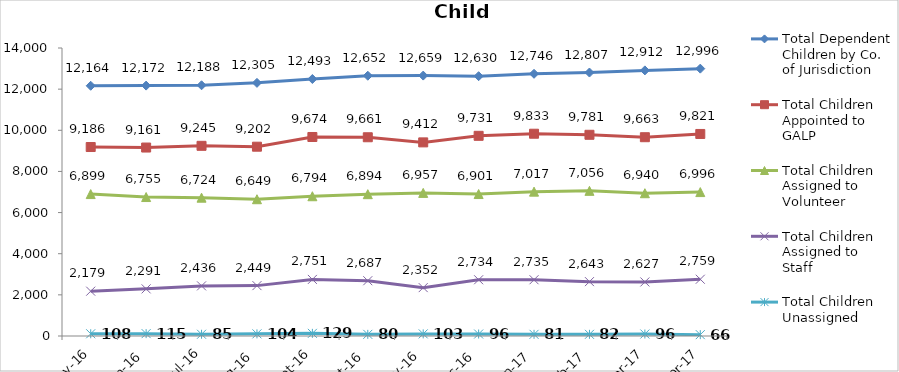
| Category | Total Dependent Children by Co. of Jurisdiction | Total Children Appointed to GALP | Total Children Assigned to Volunteer | Total Children Assigned to Staff | Total Children Unassigned |
|---|---|---|---|---|---|
| May-16 | 12164 | 9186 | 6899 | 2179 | 108 |
| Jun-16 | 12172 | 9161 | 6755 | 2291 | 115 |
| Jul-16 | 12188 | 9245 | 6724 | 2436 | 85 |
| Aug-16 | 12305 | 9202 | 6649 | 2449 | 104 |
| Sep-16 | 12493 | 9674 | 6794 | 2751 | 129 |
| Oct-16 | 12652 | 9661 | 6894 | 2687 | 80 |
| Nov-16 | 12659 | 9412 | 6957 | 2352 | 103 |
| Dec-16 | 12630 | 9731 | 6901 | 2734 | 96 |
| Jan-17 | 12746 | 9833 | 7017 | 2735 | 81 |
| Feb-17 | 12807 | 9781 | 7056 | 2643 | 82 |
| Mar-17 | 12912 | 9663 | 6940 | 2627 | 96 |
| Apr-17 | 12996 | 9821 | 6996 | 2759 | 66 |